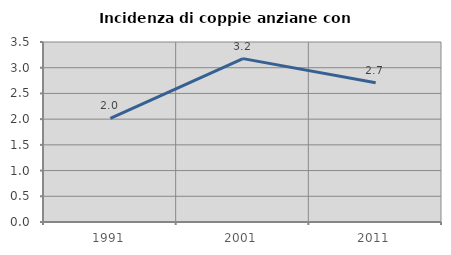
| Category | Incidenza di coppie anziane con figli |
|---|---|
| 1991.0 | 2.016 |
| 2001.0 | 3.177 |
| 2011.0 | 2.709 |